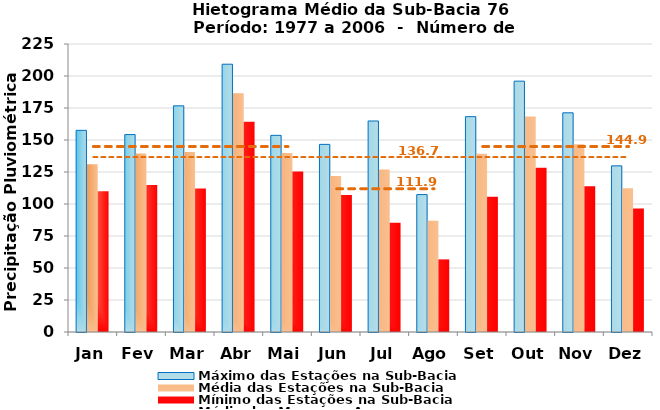
| Category | Máximo das Estações na Sub-Bacia | Média das Estações na Sub-Bacia | Mínimo das Estações na Sub-Bacia |
|---|---|---|---|
| Jan | 157.54 | 131.119 | 109.946 |
| Fev | 154.247 | 139.533 | 114.84 |
| Mar | 176.69 | 140.695 | 112.02 |
| Abr | 209.207 | 186.474 | 164.34 |
| Mai | 153.633 | 139.898 | 125.368 |
| Jun | 146.573 | 121.908 | 107.007 |
| Jul | 164.85 | 126.893 | 85.285 |
| Ago | 107.36 | 86.872 | 56.731 |
| Set | 168.247 | 139.168 | 105.567 |
| Out | 195.983 | 168.3 | 128.377 |
| Nov | 171.233 | 146.631 | 113.883 |
| Dez | 129.807 | 112.309 | 96.48 |